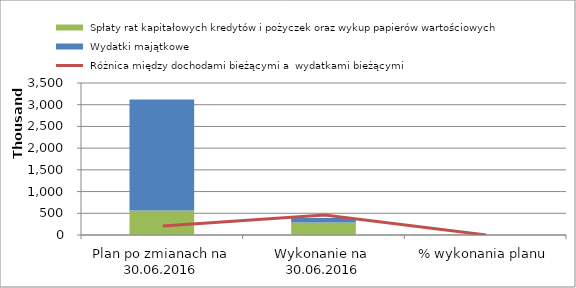
| Category |  Spłaty rat kapitałowych kredytów i pożyczek oraz wykup papierów wartościowych |  Wydatki majątkowe |
|---|---|---|
| Plan po zmianach na 30.06.2016 | 564362 | 2556763 |
| Wykonanie na  30.06.2016 | 286298.4 | 104021.88 |
| % wykonania planu | 0.507 | 0.041 |